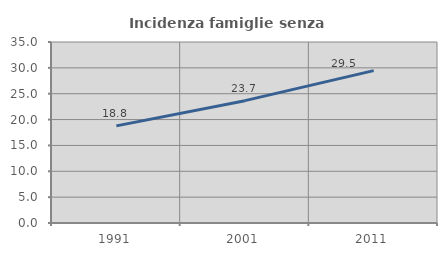
| Category | Incidenza famiglie senza nuclei |
|---|---|
| 1991.0 | 18.782 |
| 2001.0 | 23.658 |
| 2011.0 | 29.458 |